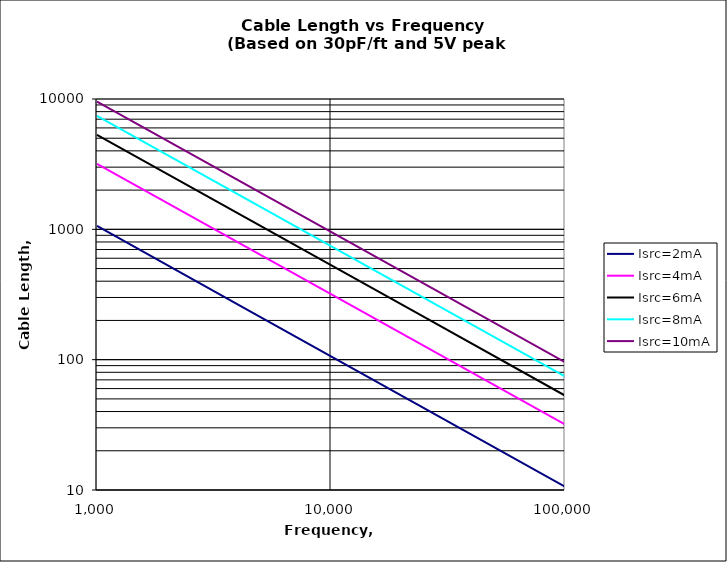
| Category | Isrc=2mA | Isrc=4mA | Isrc=6mA | Isrc=8mA | Isrc=10mA |
|---|---|---|---|---|---|
| 1000.0 | 1061.033 | 3183.099 | 5305.165 | 7427.231 | 9549.297 |
| 10000.0 | 106.103 | 318.31 | 530.516 | 742.723 | 954.93 |
| 100000.0 | 10.61 | 31.831 | 53.052 | 74.272 | 95.493 |